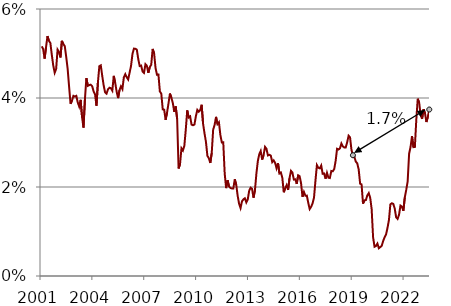
| Category | 10-year treasury yield |
|---|---|
| 2001.0 | 5.161 |
| 2001.0 | 5.099 |
| 2001.0 | 4.885 |
| 2001.0 | 5.141 |
| 2001.0 | 5.391 |
| 2001.0 | 5.284 |
| 2001.0 | 5.236 |
| 2001.0 | 4.971 |
| 2001.0 | 4.732 |
| 2001.0 | 4.567 |
| 2001.0 | 4.652 |
| 2001.0 | 5.088 |
| 2002.0 | 5.036 |
| 2002.0 | 4.912 |
| 2002.0 | 5.284 |
| 2002.0 | 5.211 |
| 2002.0 | 5.165 |
| 2002.0 | 4.926 |
| 2002.0 | 4.653 |
| 2002.0 | 4.257 |
| 2002.0 | 3.87 |
| 2002.0 | 3.941 |
| 2002.0 | 4.048 |
| 2002.0 | 4.032 |
| 2003.0 | 4.049 |
| 2003.0 | 3.903 |
| 2003.0 | 3.807 |
| 2003.0 | 3.959 |
| 2003.0 | 3.569 |
| 2003.0 | 3.334 |
| 2003.0 | 3.975 |
| 2003.0 | 4.445 |
| 2003.0 | 4.274 |
| 2003.0 | 4.29 |
| 2003.0 | 4.3 |
| 2003.0 | 4.268 |
| 2004.0 | 4.15 |
| 2004.0 | 4.084 |
| 2004.0 | 3.827 |
| 2004.0 | 4.348 |
| 2004.0 | 4.716 |
| 2004.0 | 4.734 |
| 2004.0 | 4.498 |
| 2004.0 | 4.281 |
| 2004.0 | 4.126 |
| 2004.0 | 4.097 |
| 2004.0 | 4.194 |
| 2004.0 | 4.231 |
| 2005.0 | 4.222 |
| 2005.0 | 4.165 |
| 2005.0 | 4.498 |
| 2005.0 | 4.341 |
| 2005.0 | 4.144 |
| 2005.0 | 3.998 |
| 2005.0 | 4.178 |
| 2005.0 | 4.263 |
| 2005.0 | 4.199 |
| 2005.0 | 4.464 |
| 2005.0 | 4.535 |
| 2005.0 | 4.467 |
| 2006.0 | 4.416 |
| 2006.0 | 4.569 |
| 2006.0 | 4.724 |
| 2006.0 | 4.991 |
| 2006.0 | 5.11 |
| 2006.0 | 5.106 |
| 2006.0 | 5.088 |
| 2006.0 | 4.877 |
| 2006.0 | 4.719 |
| 2006.0 | 4.729 |
| 2006.0 | 4.595 |
| 2006.0 | 4.564 |
| 2007.0 | 4.76 |
| 2007.0 | 4.723 |
| 2007.0 | 4.565 |
| 2007.0 | 4.694 |
| 2007.0 | 4.746 |
| 2007.0 | 5.103 |
| 2007.0 | 5.004 |
| 2007.0 | 4.675 |
| 2007.0 | 4.522 |
| 2007.0 | 4.528 |
| 2007.0 | 4.148 |
| 2007.0 | 4.098 |
| 2008.0 | 3.744 |
| 2008.0 | 3.738 |
| 2008.0 | 3.51 |
| 2008.0 | 3.675 |
| 2008.0 | 3.88 |
| 2008.0 | 4.1 |
| 2008.0 | 4.008 |
| 2008.0 | 3.886 |
| 2008.0 | 3.686 |
| 2008.0 | 3.814 |
| 2008.0 | 3.527 |
| 2008.0 | 2.416 |
| 2009.0 | 2.518 |
| 2009.0 | 2.87 |
| 2009.0 | 2.82 |
| 2009.0 | 2.927 |
| 2009.0 | 3.293 |
| 2009.0 | 3.722 |
| 2009.0 | 3.562 |
| 2009.0 | 3.587 |
| 2009.0 | 3.402 |
| 2009.0 | 3.388 |
| 2009.0 | 3.403 |
| 2009.0 | 3.59 |
| 2010.0 | 3.733 |
| 2010.0 | 3.691 |
| 2010.0 | 3.727 |
| 2010.0 | 3.847 |
| 2010.0 | 3.42 |
| 2010.0 | 3.204 |
| 2010.0 | 3.011 |
| 2010.0 | 2.699 |
| 2010.0 | 2.648 |
| 2010.0 | 2.54 |
| 2010.0 | 2.763 |
| 2010.0 | 3.291 |
| 2011.0 | 3.394 |
| 2011.0 | 3.576 |
| 2011.0 | 3.414 |
| 2011.0 | 3.455 |
| 2011.0 | 3.169 |
| 2011.0 | 3.002 |
| 2011.0 | 3.003 |
| 2011.0 | 2.303 |
| 2011.0 | 1.975 |
| 2011.0 | 2.152 |
| 2011.0 | 2.014 |
| 2011.0 | 1.978 |
| 2012.0 | 1.966 |
| 2012.0 | 1.968 |
| 2012.0 | 2.173 |
| 2012.0 | 2.053 |
| 2012.0 | 1.803 |
| 2012.0 | 1.622 |
| 2012.0 | 1.527 |
| 2012.0 | 1.678 |
| 2012.0 | 1.723 |
| 2012.0 | 1.746 |
| 2012.0 | 1.654 |
| 2012.0 | 1.719 |
| 2013.0 | 1.915 |
| 2013.0 | 1.984 |
| 2013.0 | 1.958 |
| 2013.0 | 1.759 |
| 2013.0 | 1.928 |
| 2013.0 | 2.3 |
| 2013.0 | 2.582 |
| 2013.0 | 2.737 |
| 2013.0 | 2.81 |
| 2013.0 | 2.616 |
| 2013.0 | 2.718 |
| 2013.0 | 2.902 |
| 2014.0 | 2.858 |
| 2014.0 | 2.709 |
| 2014.0 | 2.723 |
| 2014.0 | 2.705 |
| 2014.0 | 2.559 |
| 2014.0 | 2.599 |
| 2014.0 | 2.542 |
| 2014.0 | 2.42 |
| 2014.0 | 2.534 |
| 2014.0 | 2.304 |
| 2014.0 | 2.326 |
| 2014.0 | 2.207 |
| 2015.0 | 1.882 |
| 2015.0 | 1.975 |
| 2015.0 | 2.043 |
| 2015.0 | 1.935 |
| 2015.0 | 2.198 |
| 2015.0 | 2.364 |
| 2015.0 | 2.325 |
| 2015.0 | 2.167 |
| 2015.0 | 2.173 |
| 2015.0 | 2.07 |
| 2015.0 | 2.263 |
| 2015.0 | 2.243 |
| 2016.0 | 2.085 |
| 2016.0 | 1.78 |
| 2016.0 | 1.889 |
| 2016.0 | 1.805 |
| 2016.0 | 1.806 |
| 2016.0 | 1.644 |
| 2016.0 | 1.504 |
| 2016.0 | 1.557 |
| 2016.0 | 1.63 |
| 2016.0 | 1.764 |
| 2016.0 | 2.142 |
| 2016.0 | 2.492 |
| 2017.0 | 2.432 |
| 2017.0 | 2.419 |
| 2017.0 | 2.482 |
| 2017.0 | 2.297 |
| 2017.0 | 2.304 |
| 2017.0 | 2.187 |
| 2017.0 | 2.318 |
| 2017.0 | 2.209 |
| 2017.0 | 2.202 |
| 2017.0 | 2.36 |
| 2017.0 | 2.353 |
| 2017.0 | 2.402 |
| 2018.0 | 2.584 |
| 2018.0 | 2.859 |
| 2018.0 | 2.842 |
| 2018.0 | 2.869 |
| 2018.0 | 2.978 |
| 2018.0 | 2.912 |
| 2018.0 | 2.889 |
| 2018.0 | 2.889 |
| 2018.0 | 3.004 |
| 2018.0 | 3.152 |
| 2018.0 | 3.117 |
| 2018.0 | 2.833 |
| 2019.0 | 2.714 |
| 2019.0 | 2.676 |
| 2019.0 | 2.571 |
| 2019.0 | 2.532 |
| 2019.0 | 2.395 |
| 2019.0 | 2.074 |
| 2019.0 | 2.059 |
| 2019.0 | 1.626 |
| 2019.0 | 1.7 |
| 2019.0 | 1.707 |
| 2019.0 | 1.812 |
| 2019.0 | 1.863 |
| 2020.0 | 1.758 |
| 2020.0 | 1.504 |
| 2020.0 | 0.87 |
| 2020.0 | 0.658 |
| 2020.0 | 0.674 |
| 2020.0 | 0.729 |
| 2020.0 | 0.624 |
| 2020.0 | 0.65 |
| 2020.0 | 0.68 |
| 2020.0 | 0.787 |
| 2020.0 | 0.87 |
| 2020.0 | 0.934 |
| 2021.0 | 1.081 |
| 2021.0 | 1.258 |
| 2021.0 | 1.611 |
| 2021.0 | 1.635 |
| 2021.0 | 1.621 |
| 2021.0 | 1.519 |
| 2021.0 | 1.319 |
| 2021.0 | 1.283 |
| 2021.0 | 1.375 |
| 2021.0 | 1.582 |
| 2021.0 | 1.56 |
| 2021.0 | 1.465 |
| 2022.0 | 1.764 |
| 2022.0 | 1.934 |
| 2022.0 | 2.128 |
| 2022.0 | 2.748 |
| 2022.0 | 2.898 |
| 2022.0 | 3.143 |
| 2022.0 | 2.896 |
| 2022.0 | 2.898 |
| 2022.0 | 3.519 |
| 2022.0 | 3.984 |
| 2022.0 | 3.891 |
| 2022.0 | 3.616 |
| 2023.0 | 3.532 |
| 2023.0 | 3.747 |
| 2023.0 | 3.663 |
| 2023.0 | 3.46 |
| 2023.0 | 3.574 |
| 2023.0 | 3.741 |